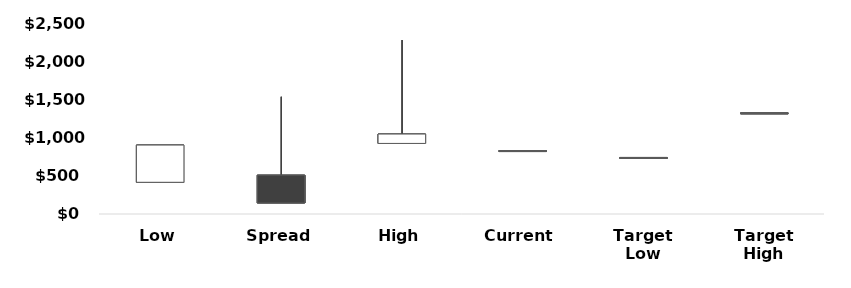
| Category | 52 Week High/Low | Analyst Price Targets | Comparable Companies EV/EBITDA | DCF Exit Multiple Method |
|---|---|---|---|---|
| Low | 415.068 | 900 | 742.429 | 902.18 |
| Spread | 508.602 | 150 | 1534.639 | 144.16 |
| High | 923.67 | 1050 | 2277.068 | 1046.34 |
| Current | 830.58 | 830.58 | 830.58 | 830.58 |
| Target Low | 739.919 | 739.919 | 739.919 | 739.919 |
| Target High | 1324.27 | 1324.27 | 1324.27 | 1324.27 |